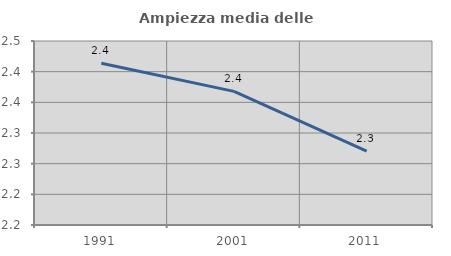
| Category | Ampiezza media delle famiglie |
|---|---|
| 1991.0 | 2.414 |
| 2001.0 | 2.368 |
| 2011.0 | 2.27 |